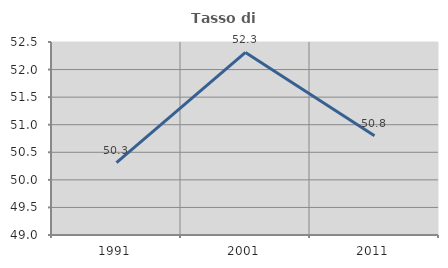
| Category | Tasso di occupazione   |
|---|---|
| 1991.0 | 50.312 |
| 2001.0 | 52.311 |
| 2011.0 | 50.799 |